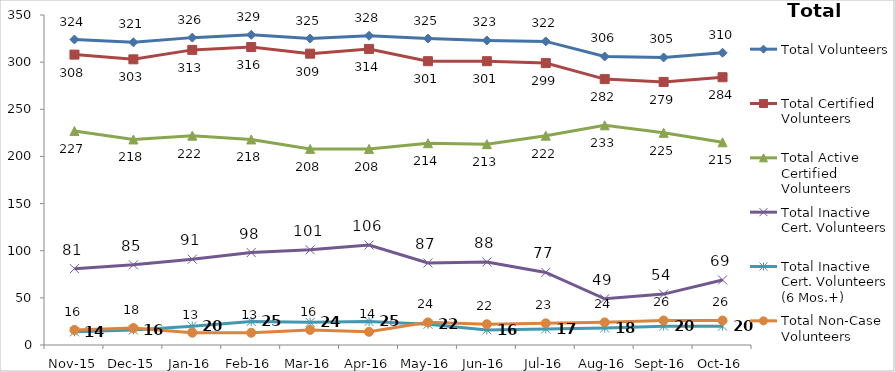
| Category | Total Volunteers | Total Certified Volunteers | Total Active Certified Volunteers | Total Inactive Cert. Volunteers | Total Inactive Cert. Volunteers (6 Mos.+) | Total Non-Case Volunteers |
|---|---|---|---|---|---|---|
| Nov-15 | 324 | 308 | 227 | 81 | 14 | 16 |
| Dec-15 | 321 | 303 | 218 | 85 | 16 | 18 |
| Jan-16 | 326 | 313 | 222 | 91 | 20 | 13 |
| Feb-16 | 329 | 316 | 218 | 98 | 25 | 13 |
| Mar-16 | 325 | 309 | 208 | 101 | 24 | 16 |
| Apr-16 | 328 | 314 | 208 | 106 | 25 | 14 |
| May-16 | 325 | 301 | 214 | 87 | 22 | 24 |
| Jun-16 | 323 | 301 | 213 | 88 | 16 | 22 |
| Jul-16 | 322 | 299 | 222 | 77 | 17 | 23 |
| Aug-16 | 306 | 282 | 233 | 49 | 18 | 24 |
| Sep-16 | 305 | 279 | 225 | 54 | 20 | 26 |
| Oct-16 | 310 | 284 | 215 | 69 | 20 | 26 |